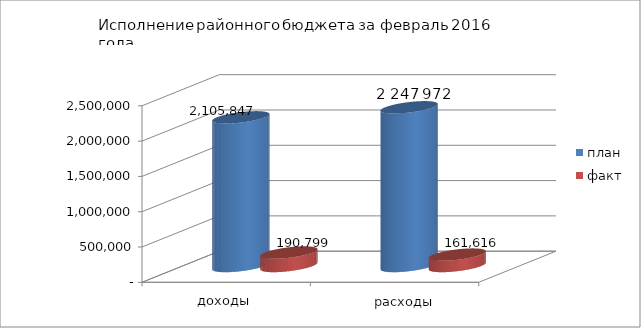
| Category | план | факт |
|---|---|---|
| 0 | 2105847.24 | 190799 |
| 1 | 2247972 | 161616 |